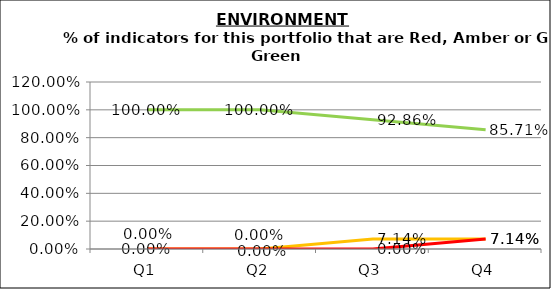
| Category | Green | Amber | Red |
|---|---|---|---|
| Q1 | 1 | 0 | 0 |
| Q2 | 1 | 0 | 0 |
| Q3 | 0.929 | 0.071 | 0 |
| Q4 | 0.857 | 0.071 | 0.071 |